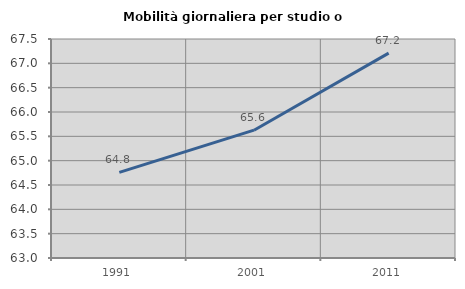
| Category | Mobilità giornaliera per studio o lavoro |
|---|---|
| 1991.0 | 64.76 |
| 2001.0 | 65.626 |
| 2011.0 | 67.21 |